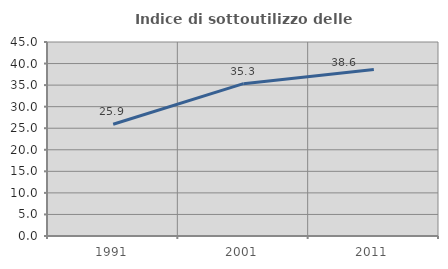
| Category | Indice di sottoutilizzo delle abitazioni  |
|---|---|
| 1991.0 | 25.926 |
| 2001.0 | 35.338 |
| 2011.0 | 38.62 |